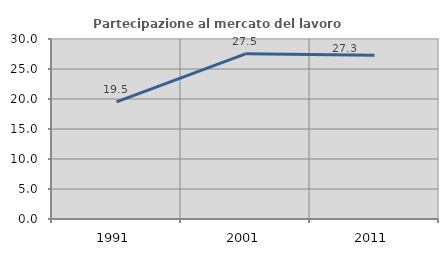
| Category | Partecipazione al mercato del lavoro  femminile |
|---|---|
| 1991.0 | 19.516 |
| 2001.0 | 27.526 |
| 2011.0 | 27.279 |